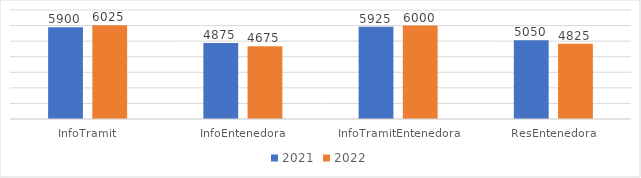
| Category | 2021 | 2022 |
|---|---|---|
| InfoTramit | 5900 | 6025 |
| InfoEntenedora | 4875 | 4675 |
| InfoTramitEntenedora | 5925 | 6000 |
| ResEntenedora | 5050 | 4825 |